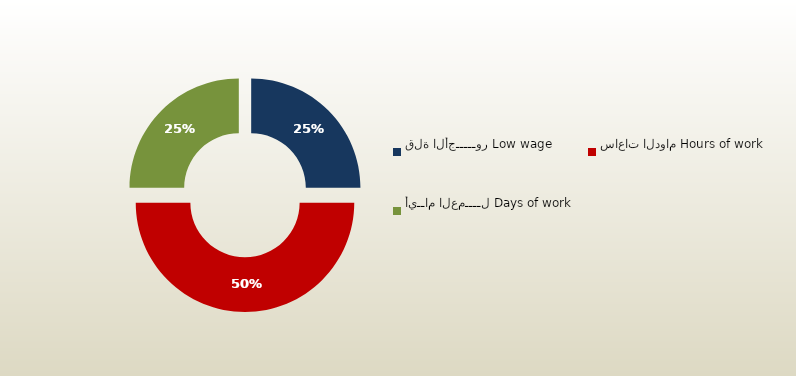
| Category | المجموع
Total |
|---|---|
| قلة الأجـــــور Low wage | 57 |
| ساعات الدوام Hours of work | 114 |
| أيــام العمــــل Days of work | 57 |